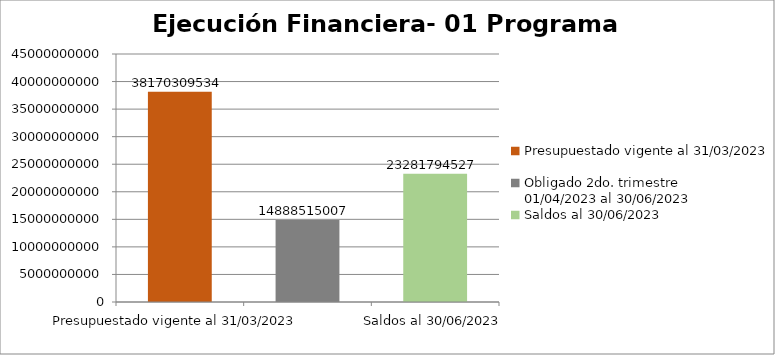
| Category | Presupuestado vigente al 31/03/2023 Obligado 2do. trimestre                      01/04/2023 al 30/06/2023 Saldos al 30/06/2023 |
|---|---|
| Presupuestado vigente al 31/03/2023 | 38170309534 |
| Obligado 2do. trimestre                      01/04/2023 al 30/06/2023 | 14888515007 |
| Saldos al 30/06/2023 | 23281794527 |